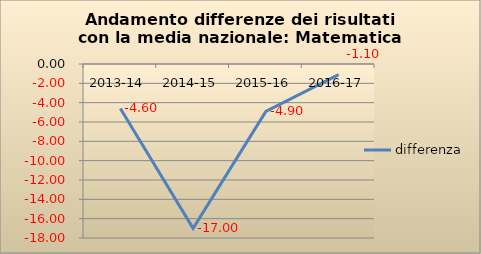
| Category | differenza |
|---|---|
| 2013-14 | -4.6 |
| 2014-15 | -17 |
| 2015-16 | -4.9 |
| 2016-17 | -1.1 |